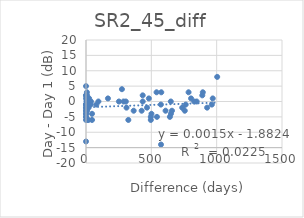
| Category | SR2_45_diff |
|---|---|
| 13.0 | -6 |
| 574.0 | -14 |
| 738.0 | -2 |
| 310.0 | -2 |
| 0.0 | -13 |
| 6.0 | -1 |
| 8.0 | 2 |
| 763.0 | -1 |
| 1004.0 | 8 |
| 0.0 | -5 |
| 18.0 | -6 |
| 79.0 | -1 |
| 0.0 | -4 |
| 609.0 | -3 |
| 0.0 | 2 |
| 36.0 | -1 |
| 576.0 | 3 |
| 543.0 | -5 |
| 0.0 | -6 |
| 9.0 | -2 |
| 6.0 | -3 |
| 46.0 | -6 |
| 29.0 | 0 |
| 0.0 | -3 |
| 3.0 | 0 |
| 642.0 | -5 |
| 0.0 | 5 |
| 0.0 | -1 |
| 0.0 | -5 |
| 0.0 | 2 |
| 481.0 | 1 |
| 95.0 | 0 |
| 0.0 | -4 |
| 6.0 | -1 |
| 1.0 | -1 |
| 168.0 | 1 |
| 927.0 | -2 |
| 467.0 | -2 |
| 46.0 | -4 |
| 21.0 | -1 |
| 324.0 | -6 |
| 970.0 | 1 |
| 38.0 | 0 |
| 963.0 | -1 |
| 573.0 | -1 |
| 0.0 | -1 |
| 21.0 | 0 |
| 275.0 | 4 |
| 847.0 | 0 |
| 10.0 | 0 |
| 434.0 | 2 |
| 649.0 | 0 |
| 496.0 | -5 |
| 894.0 | 3 |
| 434.0 | 0 |
| 20.0 | -2 |
| 426.0 | -3 |
| 305.0 | 0 |
| 890.0 | 2 |
| 6.0 | -3 |
| 14.0 | 1 |
| 287.0 | 0 |
| 365.0 | -3 |
| 738.0 | -2 |
| 650.0 | -4 |
| 540.0 | 3 |
| 756.0 | -3 |
| 7.0 | 3 |
| 0.0 | -2 |
| 252.0 | 0 |
| 501.0 | -4 |
| 16.0 | 0 |
| 496.0 | -6 |
| 658.0 | -3 |
| 785.0 | 3 |
| 804.0 | 1 |
| 0.0 | -2 |
| 0.0 | 1 |
| 828.0 | 0 |
| 0.0 | -3 |
| 24.0 | 1 |
| 10.0 | -2 |